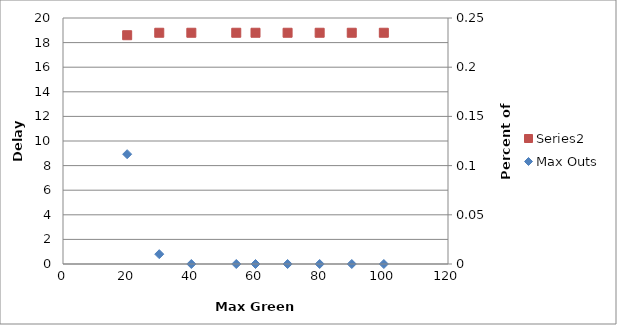
| Category | Series 1 |
|---|---|
| 100.0 | 18.8 |
| 90.0 | 18.8 |
| 80.0 | 18.8 |
| 70.0 | 18.8 |
| 60.0 | 18.8 |
| 54.0 | 18.8 |
| 40.0 | 18.8 |
| 30.0 | 18.8 |
| 20.0 | 18.6 |